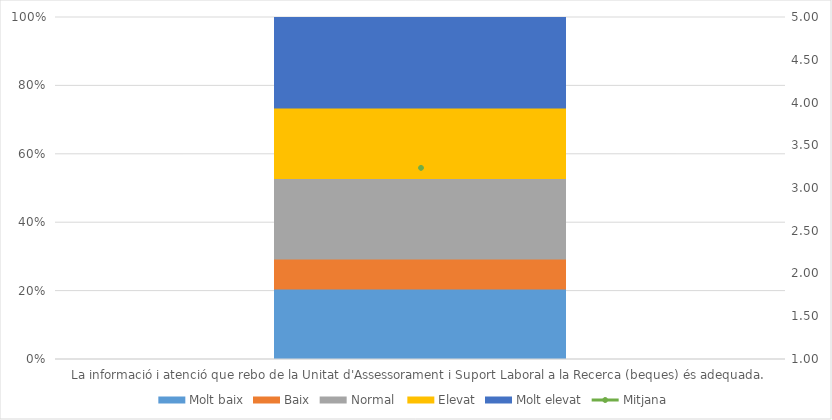
| Category | Molt baix | Baix | Normal  | Elevat | Molt elevat |
|---|---|---|---|---|---|
| La informació i atenció que rebo de la Unitat d'Assessorament i Suport Laboral a la Recerca (beques) és adequada. | 7 | 3 | 8 | 7 | 9 |